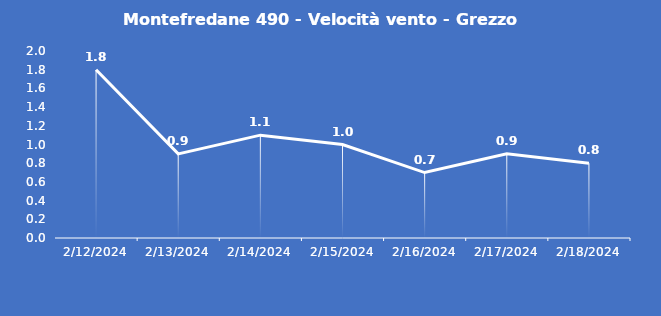
| Category | Montefredane 490 - Velocità vento - Grezzo (m/s) |
|---|---|
| 2/12/24 | 1.8 |
| 2/13/24 | 0.9 |
| 2/14/24 | 1.1 |
| 2/15/24 | 1 |
| 2/16/24 | 0.7 |
| 2/17/24 | 0.9 |
| 2/18/24 | 0.8 |